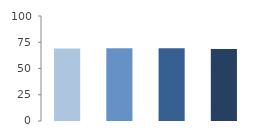
| Category | Rate (%) |
|---|---|
| 2009.0 | 68.936 |
| 2010.0 | 69.259 |
| 2011.0 | 69.29 |
| 2012.0 | 68.57 |